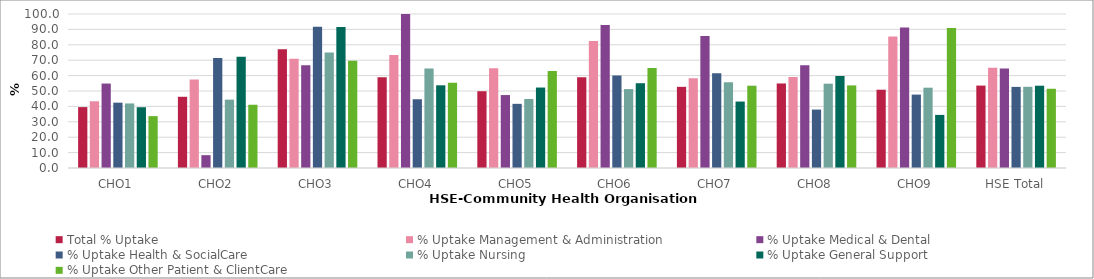
| Category | Total % Uptake | % Uptake Management & Administration | % Uptake Medical & Dental | % Uptake Health & SocialCare | % Uptake Nursing | % Uptake General Support | % Uptake Other Patient & ClientCare |
|---|---|---|---|---|---|---|---|
| CHO1 | 39.537 | 43.333 | 54.839 | 42.424 | 41.918 | 39.462 | 33.688 |
| CHO2 | 46.241 | 57.407 | 8.333 | 71.429 | 44.395 | 72.277 | 41.065 |
| CHO3 | 77.115 | 70.886 | 66.667 | 91.667 | 74.948 | 91.525 | 69.565 |
| CHO4 | 58.951 | 73.333 | 100 | 44.643 | 64.599 | 53.698 | 55.294 |
| CHO5 | 49.846 | 64.706 | 47.368 | 41.667 | 44.794 | 52.246 | 62.927 |
| CHO6 | 58.904 | 82.5 | 92.857 | 60 | 51.244 | 55.056 | 64.865 |
| CHO7 | 52.7 | 58.333 | 85.714 | 61.538 | 55.696 | 43.158 | 53.43 |
| CHO8 | 54.891 | 59.091 | 66.667 | 37.931 | 54.754 | 59.709 | 53.623 |
| CHO9 | 50.839 | 85.366 | 91.304 | 47.664 | 52.143 | 34.483 | 90.909 |
| HSE Total | 53.514 | 65.02 | 64.55 | 52.668 | 52.731 | 53.427 | 51.449 |